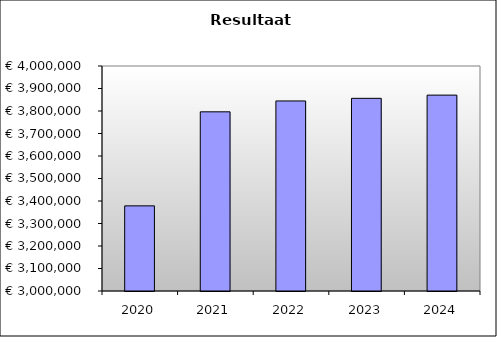
| Category | Series 0 |
|---|---|
| 2020.0 | 3378400.876 |
| 2021.0 | 3796387.311 |
| 2022.0 | 3844683.549 |
| 2023.0 | 3856288.739 |
| 2024.0 | 3870593.129 |